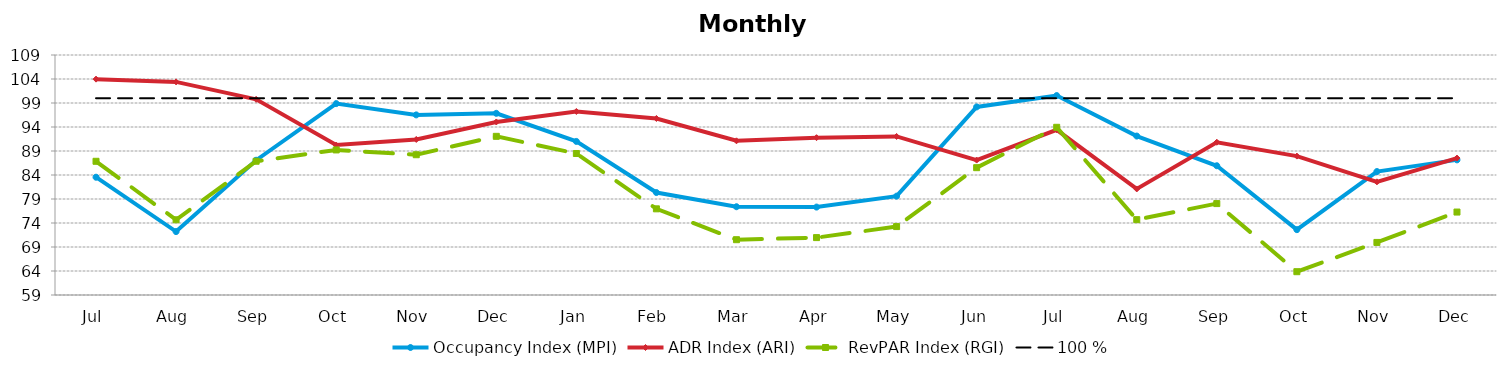
| Category | Occupancy Index (MPI) | ADR Index (ARI) | RevPAR Index (RGI) | 100 % |
|---|---|---|---|---|
| Jul | 83.54 | 103.972 | 86.858 | 100 |
| Aug | 72.214 | 103.4 | 74.67 | 100 |
| Sep | 87.075 | 99.762 | 86.867 | 100 |
| Oct | 98.872 | 90.241 | 89.223 | 100 |
| Nov | 96.521 | 91.405 | 88.224 | 100 |
| Dec | 96.85 | 95.049 | 92.055 | 100 |
| Jan | 90.994 | 97.237 | 88.48 | 100 |
| Feb | 80.343 | 95.78 | 76.952 | 100 |
| Mar | 77.391 | 91.125 | 70.522 | 100 |
| Apr | 77.316 | 91.775 | 70.957 | 100 |
| May | 79.594 | 92.035 | 73.255 | 100 |
| Jun | 98.184 | 87.106 | 85.524 | 100 |
| Jul | 100.55 | 93.421 | 93.936 | 100 |
| Aug | 92.115 | 81.094 | 74.7 | 100 |
| Sep | 85.926 | 90.829 | 78.046 | 100 |
| Oct | 72.615 | 87.936 | 63.855 | 100 |
| Nov | 84.715 | 82.575 | 69.953 | 100 |
| Dec | 87.151 | 87.526 | 76.28 | 100 |